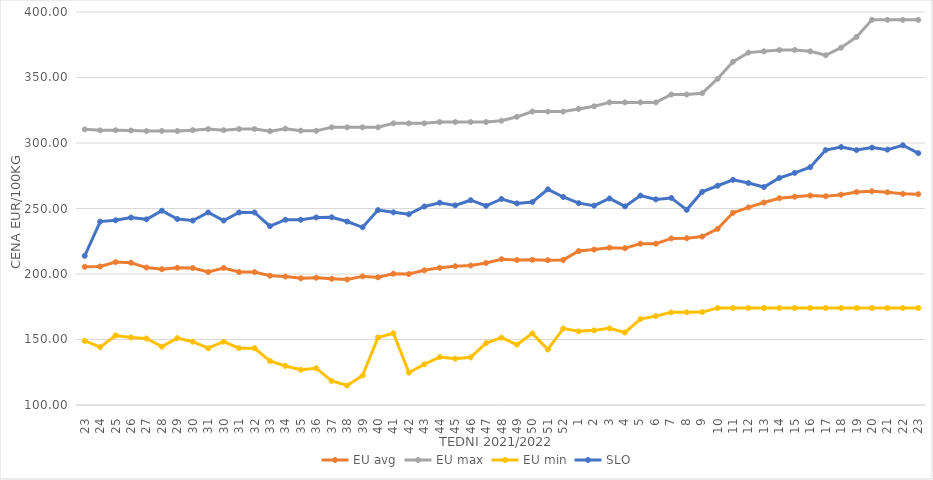
| Category | EU avg | EU max | EU min | SLO |
|---|---|---|---|---|
| 23.0 | 205.51 | 310.41 | 148.928 | 213.84 |
| 24.0 | 205.73 | 309.64 | 144.161 | 239.99 |
| 25.0 | 209.095 | 309.74 | 153.081 | 240.99 |
| 26.0 | 208.551 | 309.55 | 151.599 | 243.11 |
| 27.0 | 204.914 | 309.08 | 150.789 | 241.72 |
| 28.0 | 203.681 | 309.21 | 144.56 | 248.33 |
| 29.0 | 204.773 | 309.15 | 151.052 | 241.96 |
| 30.0 | 204.558 | 309.78 | 148.33 | 240.79 |
| 31.0 | 201.483 | 310.67 | 143.33 | 247 |
| 30.0 | 204.558 | 309.78 | 148.33 | 240.79 |
| 31.0 | 201.483 | 310.67 | 143.33 | 247 |
| 32.0 | 201.483 | 310.67 | 143.33 | 247 |
| 33.0 | 198.691 | 309 | 133.607 | 236.54 |
| 34.0 | 198.027 | 310.9 | 129.797 | 241.45 |
| 35.0 | 196.72 | 309.41 | 126.926 | 241.39 |
| 36.0 | 197.157 | 309.28 | 128.099 | 243.19 |
| 37.0 | 196.375 | 312 | 118.364 | 243.28 |
| 38.0 | 195.821 | 312 | 114.892 | 240.06 |
| 39.0 | 198.179 | 312 | 122.517 | 235.66 |
| 40.0 | 197.482 | 312 | 151.488 | 248.77 |
| 41.0 | 200.22 | 315 | 154.74 | 247.07 |
| 42.0 | 199.965 | 315 | 124.748 | 245.64 |
| 43.0 | 202.804 | 315 | 131.104 | 251.53 |
| 44.0 | 204.713 | 316 | 136.6 | 254.42 |
| 45.0 | 205.906 | 316 | 135.362 | 252.35 |
| 46.0 | 206.476 | 316 | 136.39 | 256.33 |
| 47.0 | 208.415 | 316 | 147.192 | 252.01 |
| 48.0 | 211.314 | 317 | 151.41 | 257.25 |
| 49.0 | 210.677 | 320 | 146.064 | 253.87 |
| 50.0 | 210.823 | 324 | 154.698 | 254.94 |
| 51.0 | 210.59 | 324 | 142.382 | 264.65 |
| 52.0 | 210.763 | 324 | 158.333 | 258.8 |
| 1.0 | 217.519 | 326 | 156.222 | 254.09 |
| 2.0 | 218.654 | 328 | 156.969 | 252.15 |
| 3.0 | 220.098 | 331 | 158.511 | 257.65 |
| 4.0 | 219.685 | 331 | 155.346 | 251.6 |
| 5.0 | 223.143 | 331 | 165.59 | 259.87 |
| 6.0 | 223.178 | 331 | 167.86 | 256.97 |
| 7.0 | 227.145 | 337 | 170.719 | 258.07 |
| 8.0 | 227.312 | 337 | 170.743 | 248.97 |
| 9.0 | 228.588 | 338 | 170.92 | 262.72 |
| 10.0 | 234.434 | 349 | 174 | 267.38 |
| 11.0 | 246.762 | 362 | 174 | 271.86 |
| 12.0 | 250.845 | 369 | 174 | 269.43 |
| 13.0 | 254.568 | 370 | 174 | 266.39 |
| 14.0 | 257.819 | 371 | 174 | 273.3 |
| 15.0 | 259 | 371 | 174 | 277.18 |
| 16.0 | 259.873 | 370 | 174 | 281.55 |
| 17.0 | 259.349 | 367 | 174 | 294.59 |
| 18.0 | 260.528 | 372.758 | 174 | 296.93 |
| 19.0 | 262.562 | 381 | 174 | 294.6 |
| 20.0 | 263.156 | 394 | 174 | 296.48 |
| 21.0 | 262.367 | 394 | 174 | 294.94 |
| 22.0 | 261.208 | 394 | 174 | 298.26 |
| 23.0 | 260.904 | 394 | 174 | 292.27 |